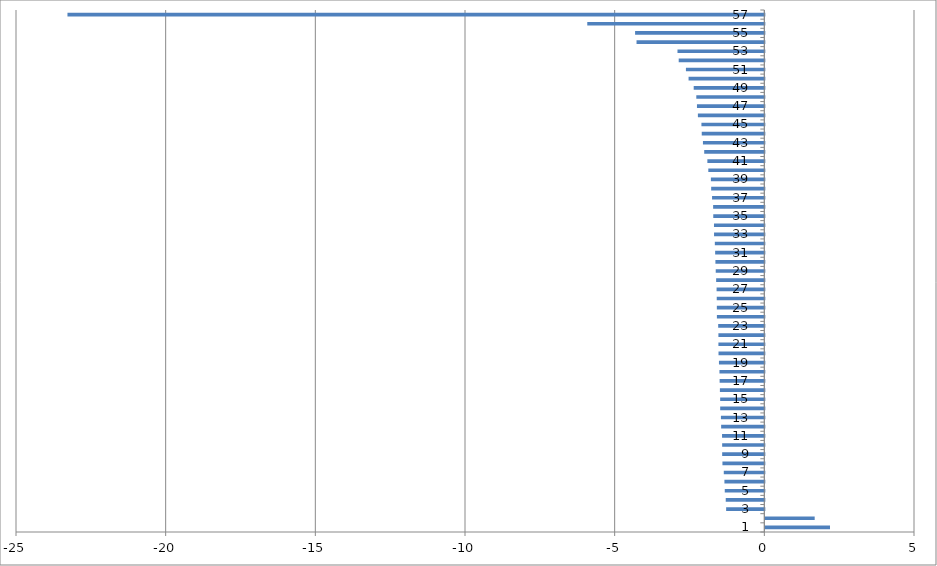
| Category | Series 0 |
|---|---|
| 0 | 2.16 |
| 1 | 1.649 |
| 2 | -1.276 |
| 3 | -1.289 |
| 4 | -1.322 |
| 5 | -1.333 |
| 6 | -1.355 |
| 7 | -1.4 |
| 8 | -1.409 |
| 9 | -1.409 |
| 10 | -1.413 |
| 11 | -1.443 |
| 12 | -1.45 |
| 13 | -1.475 |
| 14 | -1.475 |
| 15 | -1.485 |
| 16 | -1.494 |
| 17 | -1.499 |
| 18 | -1.516 |
| 19 | -1.531 |
| 20 | -1.534 |
| 21 | -1.534 |
| 22 | -1.542 |
| 23 | -1.585 |
| 24 | -1.587 |
| 25 | -1.59 |
| 26 | -1.595 |
| 27 | -1.61 |
| 28 | -1.624 |
| 29 | -1.634 |
| 30 | -1.643 |
| 31 | -1.654 |
| 32 | -1.68 |
| 33 | -1.682 |
| 34 | -1.706 |
| 35 | -1.711 |
| 36 | -1.746 |
| 37 | -1.776 |
| 38 | -1.786 |
| 39 | -1.871 |
| 40 | -1.903 |
| 41 | -2.009 |
| 42 | -2.051 |
| 43 | -2.091 |
| 44 | -2.101 |
| 45 | -2.22 |
| 46 | -2.251 |
| 47 | -2.273 |
| 48 | -2.36 |
| 49 | -2.531 |
| 50 | -2.62 |
| 51 | -2.861 |
| 52 | -2.901 |
| 53 | -4.27 |
| 54 | -4.318 |
| 55 | -5.915 |
| 56 | -23.281 |